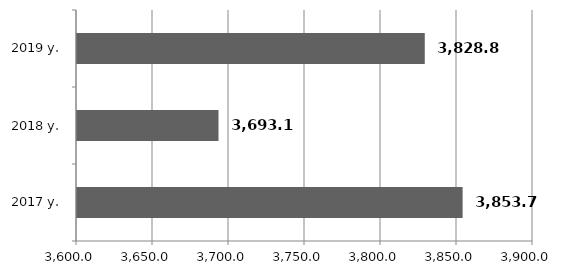
| Category | Series 0 |
|---|---|
| 2017 y. | 3853.7 |
| 2018 y. | 3693.097 |
| 2019 y. | 3828.8 |